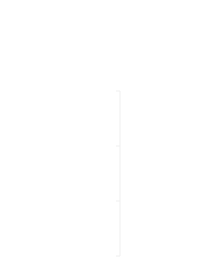
| Category | Positivt | Negativt |
|---|---|---|
| 0 | 0 | 0 |
| 1 | 169 | 0 |
| 2 | 169 | -169 |